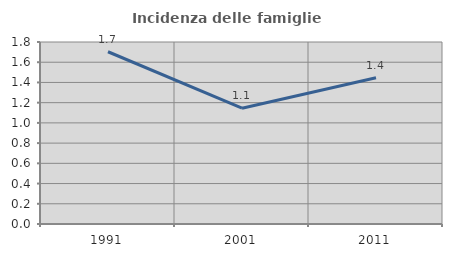
| Category | Incidenza delle famiglie numerose |
|---|---|
| 1991.0 | 1.704 |
| 2001.0 | 1.145 |
| 2011.0 | 1.446 |